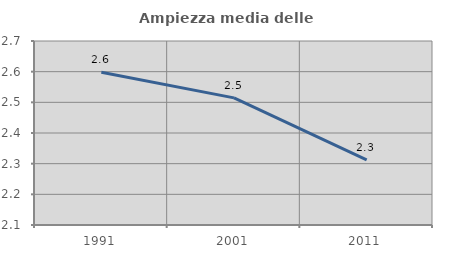
| Category | Ampiezza media delle famiglie |
|---|---|
| 1991.0 | 2.598 |
| 2001.0 | 2.514 |
| 2011.0 | 2.312 |